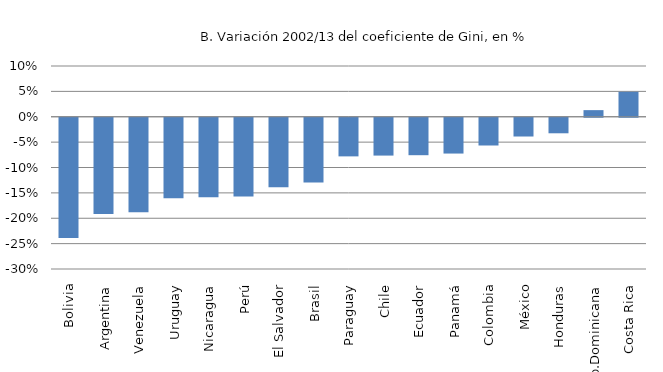
| Category | Variación 2002/2013 |
|---|---|
| Bolivia | -0.237 |
| Argentina | -0.19 |
| Venezuela | -0.186 |
| Uruguay | -0.159 |
| Nicaragua | -0.157 |
| Perú | -0.155 |
| El Salvador | -0.137 |
| Brasil | -0.128 |
| Paraguay | -0.076 |
| Chile | -0.075 |
| Ecuador | -0.074 |
| Panamá | -0.071 |
| Colombia | -0.055 |
| México | -0.037 |
| Honduras | -0.031 |
| Rep.Dominicana | 0.013 |
| Costa Rica | 0.049 |